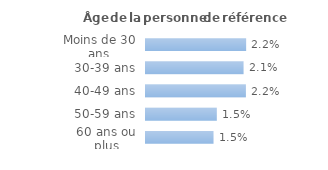
| Category | Series 0 |
|---|---|
| Moins de 30 ans | 0.022 |
| 30-39 ans | 0.021 |
| 40-49 ans | 0.022 |
| 50-59 ans | 0.015 |
| 60 ans ou plus | 0.015 |